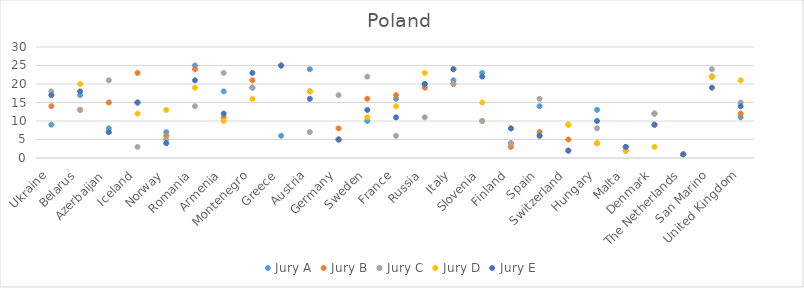
| Category | Jury A | Jury B | Jury C | Jury D | Jury E |
|---|---|---|---|---|---|
| Ukraine | 9 | 14 | 18 | 17 | 17 |
| Belarus | 17 | 13 | 13 | 20 | 18 |
| Azerbaijan | 8 | 15 | 21 | 7 | 7 |
| Iceland | 15 | 23 | 3 | 12 | 15 |
| Norway | 7 | 6 | 5 | 13 | 4 |
| Romania | 25 | 24 | 14 | 19 | 21 |
| Armenia | 18 | 11 | 23 | 10 | 12 |
| Montenegro | 19 | 21 | 19 | 16 | 23 |
| Greece | 6 | 25 | 25 | 25 | 25 |
| Austria | 24 | 18 | 7 | 18 | 16 |
| Germany | 5 | 8 | 17 | 5 | 5 |
| Sweden | 10 | 16 | 22 | 11 | 13 |
| France | 16 | 17 | 6 | 14 | 11 |
| Russia | 20 | 19 | 11 | 23 | 20 |
| Italy | 21 | 20 | 20 | 24 | 24 |
| Slovenia | 23 | 10 | 10 | 15 | 22 |
| Finland | 4 | 3 | 4 | 8 | 8 |
| Spain | 14 | 7 | 16 | 6 | 6 |
| Switzerland | 2 | 5 | 9 | 9 | 2 |
| Hungary | 13 | 4 | 8 | 4 | 10 |
| Malta | 3 | 2 | 2 | 2 | 3 |
| Denmark | 12 | 9 | 12 | 3 | 9 |
| The Netherlands | 1 | 1 | 1 | 1 | 1 |
| San Marino | 22 | 22 | 24 | 22 | 19 |
| United Kingdom | 11 | 12 | 15 | 21 | 14 |